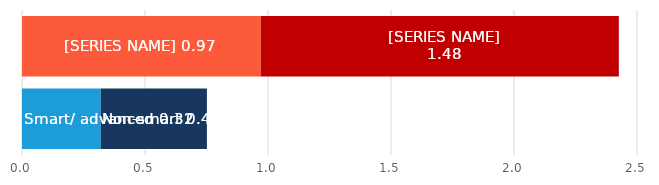
| Category | Smart/Advanced meters | Non-smart meters |
|---|---|---|
| Gas | 319892 | 431771 |
| Electricity | 970635 | 1455535 |